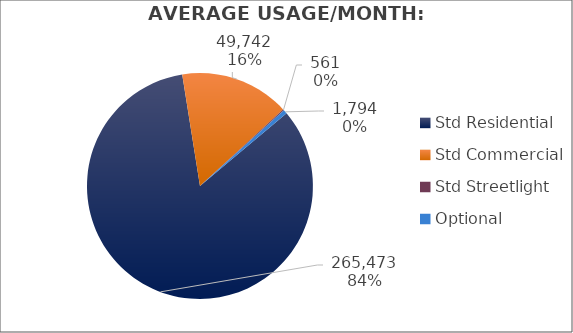
| Category | Usage |
|---|---|
| Std Residential | 265473 |
| Std Commercial | 49742.333 |
| Std Streetlight | 561 |
| Optional | 1794 |